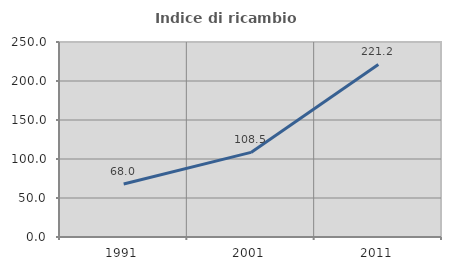
| Category | Indice di ricambio occupazionale  |
|---|---|
| 1991.0 | 68.017 |
| 2001.0 | 108.465 |
| 2011.0 | 221.246 |